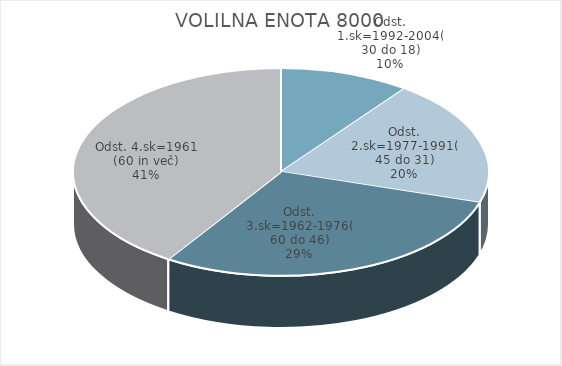
| Category | VOLILNA ENOTA 8000 |
|---|---|
| Odst. 1.sk=1992-2004(30 do 18) | 5.04 |
| Odst. 2.sk=1977-1991(45 do 31) | 9.76 |
| Odst. 3.sk=1962-1976(60 do 46) | 14.54 |
| Odst. 4.sk=1961 (60 in več) | 20.3 |